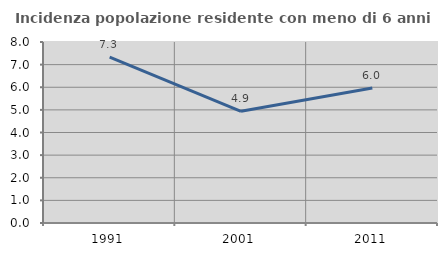
| Category | Incidenza popolazione residente con meno di 6 anni |
|---|---|
| 1991.0 | 7.33 |
| 2001.0 | 4.936 |
| 2011.0 | 5.971 |